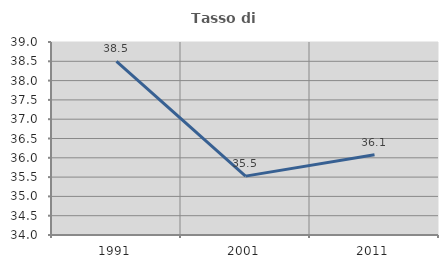
| Category | Tasso di occupazione   |
|---|---|
| 1991.0 | 38.496 |
| 2001.0 | 35.525 |
| 2011.0 | 36.081 |